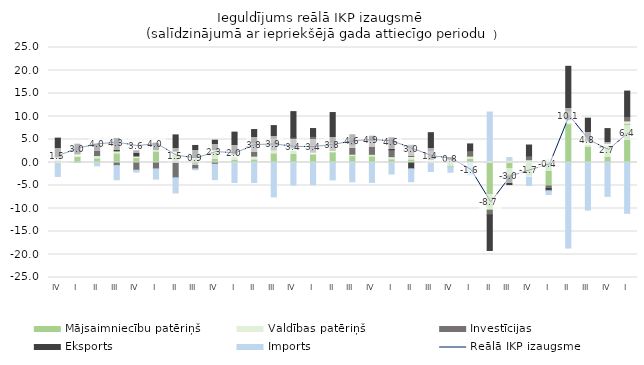
| Category | Mājsaimniecību patēriņš | Valdības patēriņš | Investīcijas | Eksports | Imports |
|---|---|---|---|---|---|
| IV | 0.524 | 0.634 | 0.238 | 3.907 | -3.031 |
| I | 1.292 | 0.594 | 0.024 | 2.072 | -0.009 |
| II | 0.957 | 0.546 | 1.113 | 1.376 | -0.729 |
| III | 2.021 | 0.497 | -0.672 | 2.712 | -3.08 |
| IV | 1.049 | 0.366 | -1.669 | 1.14 | -0.427 |
| I | 2.447 | 0.324 | -1.389 | 1.432 | -2.22 |
| II | 2.16 | 0.314 | -3.328 | 3.53 | -3.287 |
| III | 0.891 | 0.379 | -1.378 | 2.437 | -0.202 |
| IV | 2.229 | 0.538 | -0.378 | 2.081 | -3.346 |
| I | 1.204 | 0.598 | 0.319 | 4.483 | -4.35 |
| II | 0.71 | 0.679 | 2.98 | 2.795 | -4.355 |
| III | 2.048 | 0.653 | 2.631 | 2.692 | -7.465 |
| IV | 2.609 | 0.535 | 2.344 | 5.574 | -4.893 |
| I | 1.814 | 0.428 | 3.444 | 1.698 | -4.811 |
| II | 2.276 | 0.33 | 1.821 | 6.434 | -3.775 |
| III | 1.489 | 0.316 | 2.036 | 2.189 | -4.189 |
| IV | 1.392 | 0.386 | 3.023 | 0.92 | -4.325 |
| I | 0.771 | 0.499 | 1.487 | 2.615 | -2.514 |
| II | 0.706 | 0.592 | 2.447 | -1.372 | -2.804 |
| III | 0.049 | 0.625 | 1.976 | 3.834 | -1.96 |
| IV | -0.964 | 0.581 | 0.254 | 0.193 | -1.167 |
| I | 0.882 | 0.508 | 1.189 | 1.462 | -2.672 |
| II | -10.442 | 0.434 | -0.957 | -7.725 | 10.535 |
| III | -2.693 | 0.488 | -0.413 | -1.693 | 0.584 |
| IV | -2.942 | 0.601 | 0.834 | 2.366 | -2.067 |
| I | -5.116 | 0.739 | -0.533 | -0.49 | -0.836 |
| II | 8.407 | 0.9 | 1.952 | 9.65 | -18.598 |
| III | 3.876 | 0.799 | 1.048 | 3.91 | -10.353 |
| IV | 3.507 | 0.676 | 0.05 | 3.14 | -7.367 |
| I | 8.486 | 0.556 | 0.968 | 5.516 | -11.052 |